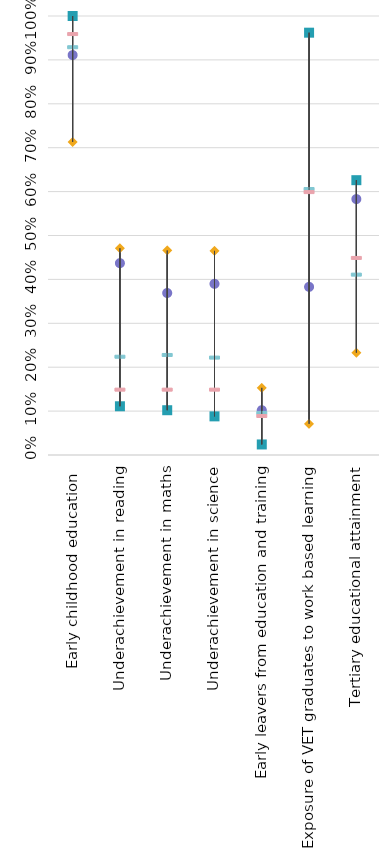
| Category | Cyprus | Strongest performer | Weakest performer | EU average | EU target |
|---|---|---|---|---|---|
| Early childhood education  | 0.911 | 1 | 0.713 | 0.93 | 0.96 |
| Underachievement in reading | 0.437 | 0.111 | 0.471 | 0.225 | 0.15 |
| Underachievement in maths | 0.369 | 0.102 | 0.466 | 0.229 | 0.15 |
| Underachievement in science | 0.39 | 0.088 | 0.465 | 0.223 | 0.15 |
| Early leavers from education and training | 0.102 | 0.024 | 0.153 | 0.097 | 0.09 |
| Exposure of VET graduates to work based learning  | 0.383 | 0.962 | 0.071 | 0.607 | 0.6 |
| Tertiary educational attainment | 0.583 | 0.626 | 0.233 | 0.412 | 0.45 |